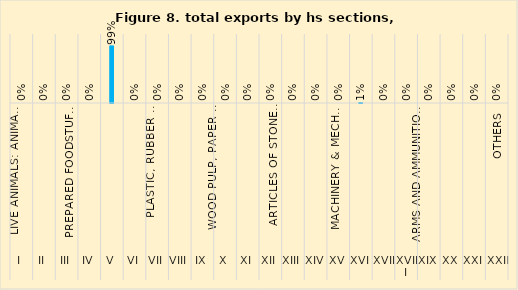
| Category | 2022% |
|---|---|
| 0 | 0 |
| 1 | 0 |
| 2 | 0 |
| 3 | 0 |
| 4 | 0.993 |
| 5 | 0 |
| 6 | 0 |
| 7 | 0 |
| 8 | 0 |
| 9 | 0 |
| 10 | 0 |
| 11 | 0 |
| 12 | 0 |
| 13 | 0 |
| 14 | 0 |
| 15 | 0.007 |
| 16 | 0 |
| 17 | 0 |
| 18 | 0 |
| 19 | 0 |
| 20 | 0 |
| 21 | 0 |